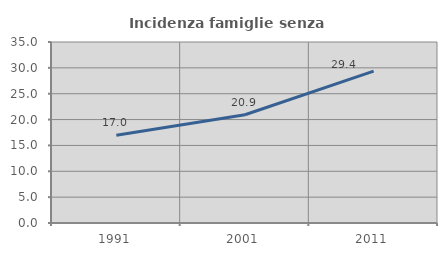
| Category | Incidenza famiglie senza nuclei |
|---|---|
| 1991.0 | 16.953 |
| 2001.0 | 20.936 |
| 2011.0 | 29.369 |